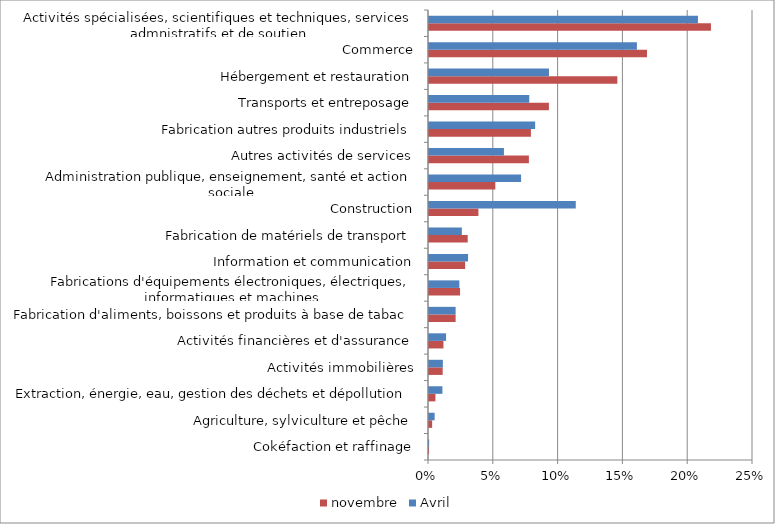
| Category | novembre | Avril |
|---|---|---|
| Cokéfaction et raffinage | 0 | 0 |
| Agriculture, sylviculture et pêche | 0.002 | 0.004 |
| Extraction, énergie, eau, gestion des déchets et dépollution | 0.005 | 0.01 |
| Activités immobilières | 0.011 | 0.011 |
| Activités financières et d'assurance | 0.011 | 0.013 |
| Fabrication d'aliments, boissons et produits à base de tabac | 0.021 | 0.021 |
| Fabrications d'équipements électroniques, électriques, informatiques et machines | 0.024 | 0.023 |
| Information et communication | 0.028 | 0.03 |
| Fabrication de matériels de transport | 0.03 | 0.025 |
| Construction | 0.038 | 0.113 |
| Administration publique, enseignement, santé et action sociale | 0.051 | 0.071 |
| Autres activités de services | 0.077 | 0.058 |
| Fabrication autres produits industriels | 0.079 | 0.082 |
| Transports et entreposage | 0.093 | 0.077 |
| Hébergement et restauration | 0.145 | 0.093 |
| Commerce | 0.168 | 0.16 |
| Activités spécialisées, scientifiques et techniques, services admnistratifs et de soutien | 0.218 | 0.208 |